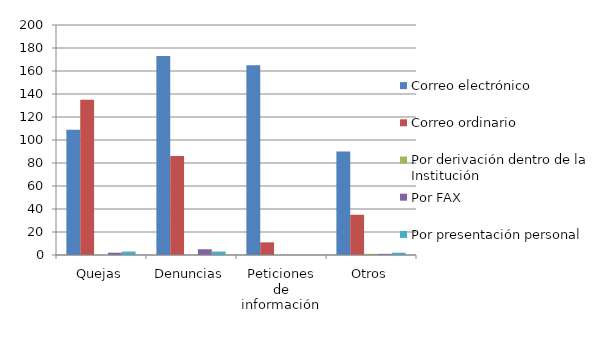
| Category | Correo electrónico  | Correo ordinario | Por derivación dentro de la Institución | Por FAX | Por presentación personal |
|---|---|---|---|---|---|
| Quejas | 109 | 135 | 0 | 2 | 3 |
| Denuncias | 173 | 86 | 0 | 5 | 3 |
| Peticiones de información | 165 | 11 | 0 | 0 | 0 |
| Otros | 90 | 35 | 1 | 1 | 2 |